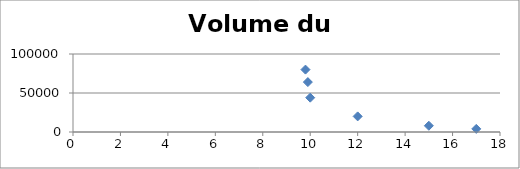
| Category | Volume du confinement |
|---|---|
| 17.0 | 4000 |
| 15.0 | 8000 |
| 12.0 | 20000 |
| 10.0 | 44000 |
| 9.9 | 64000 |
| 9.8 | 80000 |